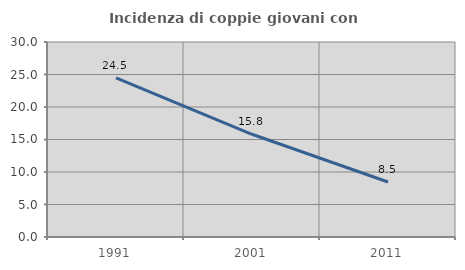
| Category | Incidenza di coppie giovani con figli |
|---|---|
| 1991.0 | 24.494 |
| 2001.0 | 15.803 |
| 2011.0 | 8.459 |